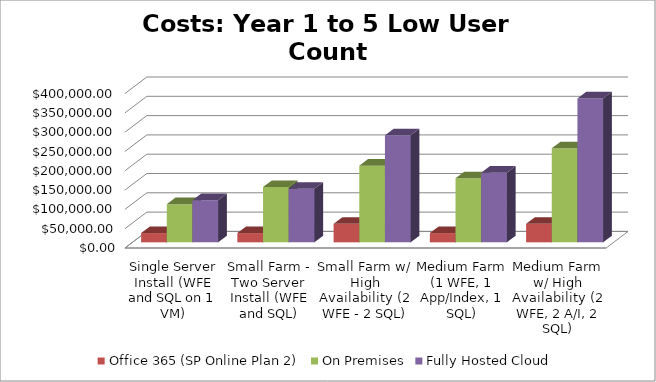
| Category | Office 365 (SP Online Plan 2) | On Premises | Fully Hosted Cloud |
|---|---|---|---|
| Single Server Install (WFE and SQL on 1 VM) | 24000 | 98722.828 | 109100 |
| Small Farm - Two Server Install (WFE and SQL) | 24000 | 143226.068 | 138500 |
| Small Farm w/ High Availability (2 WFE - 2 SQL) | 48000 | 198518.957 | 277300 |
| Medium Farm (1 WFE, 1 App/Index, 1 SQL) | 24000 | 165746.631 | 180500 |
| Medium Farm w/ High Availability (2 WFE, 2 A/I, 2 SQL) | 48000 | 243649.217 | 372700 |